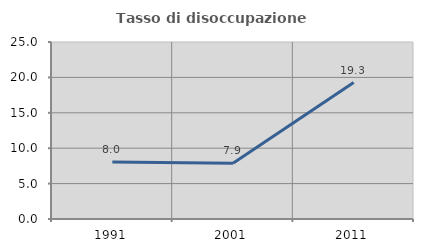
| Category | Tasso di disoccupazione giovanile  |
|---|---|
| 1991.0 | 8.04 |
| 2001.0 | 7.857 |
| 2011.0 | 19.266 |